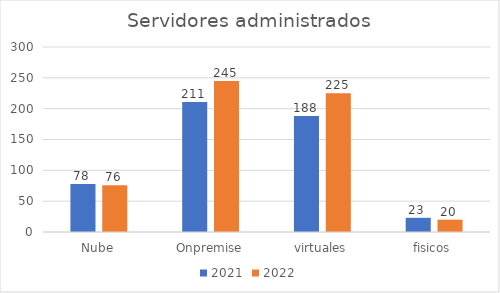
| Category | 2021 | 2022 |
|---|---|---|
| Nube | 78 | 76 |
| Onpremise | 211 | 245 |
| virtuales | 188 | 225 |
| fisicos | 23 | 20 |